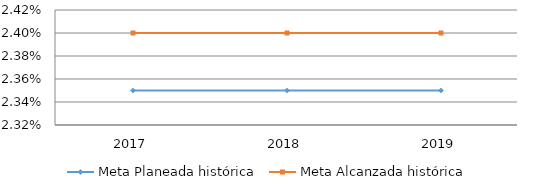
| Category | Meta Planeada histórica | Meta Alcanzada histórica |
|---|---|---|
| 0 | 0.024 | 0.024 |
| 1 | 0.024 | 0.024 |
| 2 | 0.024 | 0.024 |